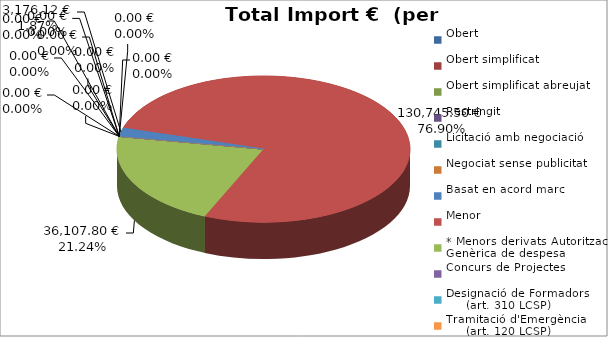
| Category | Total preu
(amb IVA) |
|---|---|
| Obert | 0 |
| Obert simplificat | 0 |
| Obert simplificat abreujat | 0 |
| Restringit | 0 |
| Licitació amb negociació | 0 |
| Negociat sense publicitat | 0 |
| Basat en acord marc | 3176.12 |
| Menor | 130745.5 |
| * Menors derivats Autorització Genèrica de despesa | 36107.8 |
| Concurs de Projectes | 0 |
| Designació de Formadors
     (art. 310 LCSP) | 0 |
| Tramitació d'Emergència
     (art. 120 LCSP) | 0 |